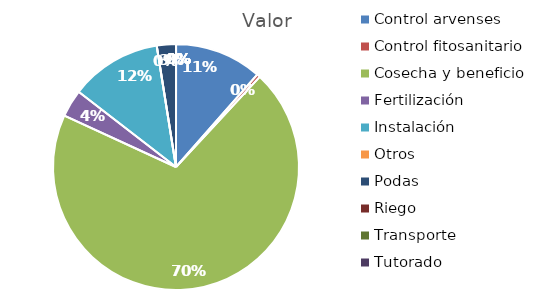
| Category | Valor |
|---|---|
| Control arvenses | 4719104 |
| Control fitosanitario | 179776 |
| Cosecha y beneficio | 28781817 |
| Fertilización | 1483152 |
| Instalación | 4943840 |
| Otros | 0 |
| Podas | 1033712 |
| Riego | 0 |
| Transporte | 0 |
| Tutorado | 0 |